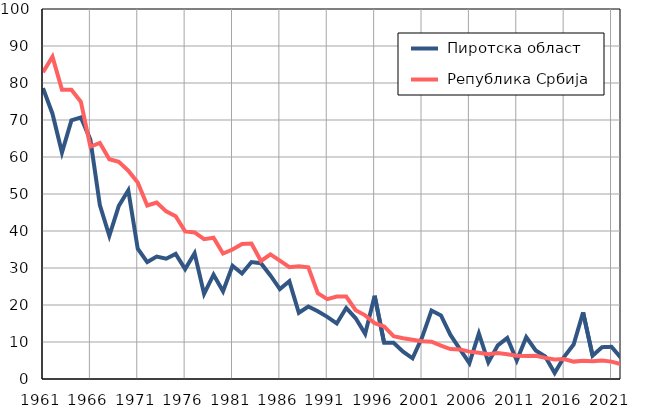
| Category |  Пиротска област |  Република Србија |
|---|---|---|
| 1961.0 | 78.6 | 82.9 |
| 1962.0 | 71.7 | 87.1 |
| 1963.0 | 61.2 | 78.2 |
| 1964.0 | 69.9 | 78.2 |
| 1965.0 | 70.7 | 74.9 |
| 1966.0 | 64.7 | 62.8 |
| 1967.0 | 47 | 63.8 |
| 1968.0 | 38.7 | 59.4 |
| 1969.0 | 46.8 | 58.7 |
| 1970.0 | 51 | 56.3 |
| 1971.0 | 35.2 | 53.1 |
| 1972.0 | 31.6 | 46.9 |
| 1973.0 | 33.1 | 47.7 |
| 1974.0 | 32.5 | 45.3 |
| 1975.0 | 33.8 | 44 |
| 1976.0 | 29.7 | 39.9 |
| 1977.0 | 34 | 39.6 |
| 1978.0 | 23 | 37.8 |
| 1979.0 | 28.2 | 38.2 |
| 1980.0 | 23.7 | 33.9 |
| 1981.0 | 30.6 | 35 |
| 1982.0 | 28.5 | 36.5 |
| 1983.0 | 31.6 | 36.6 |
| 1984.0 | 31.3 | 31.9 |
| 1985.0 | 28 | 33.7 |
| 1986.0 | 24.3 | 32 |
| 1987.0 | 26.4 | 30.2 |
| 1988.0 | 17.9 | 30.5 |
| 1989.0 | 19.6 | 30.2 |
| 1990.0 | 18.3 | 23.2 |
| 1991.0 | 16.8 | 21.6 |
| 1992.0 | 15 | 22.3 |
| 1993.0 | 19.2 | 22.3 |
| 1994.0 | 16.4 | 18.6 |
| 1995.0 | 12.2 | 17.2 |
| 1996.0 | 22.5 | 15.1 |
| 1997.0 | 9.8 | 14.2 |
| 1998.0 | 9.8 | 11.6 |
| 1999.0 | 7.4 | 11 |
| 2000.0 | 5.6 | 10.6 |
| 2001.0 | 11.2 | 10.2 |
| 2002.0 | 18.5 | 10.1 |
| 2003.0 | 17.2 | 9 |
| 2004.0 | 11.9 | 8.1 |
| 2005.0 | 8.1 | 8 |
| 2006.0 | 4.3 | 7.4 |
| 2007.0 | 12.3 | 7.1 |
| 2008.0 | 4.5 | 6.7 |
| 2009.0 | 9.1 | 7 |
| 2010.0 | 11.1 | 6.7 |
| 2011.0 | 5 | 6.3 |
| 2012.0 | 11.3 | 6.2 |
| 2013.0 | 7.7 | 6.3 |
| 2014.0 | 6.1 | 5.7 |
| 2015.0 | 1.6 | 5.3 |
| 2016.0 | 6 | 5.4 |
| 2017.0 | 9.3 | 4.7 |
| 2018.0 | 18 | 4.9 |
| 2019.0 | 6.3 | 4.8 |
| 2020.0 | 8.6 | 5 |
| 2021.0 | 8.7 | 4.7 |
| 2022.0 | 5.7 | 4 |